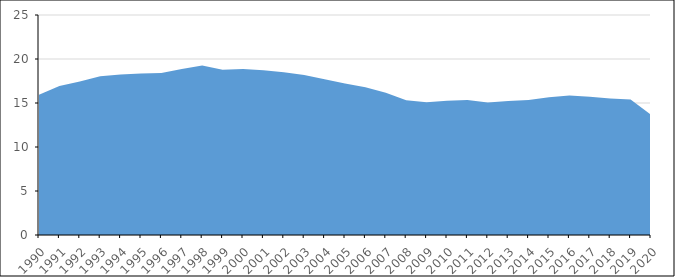
| Category | Véhicules utilitaires légers |
|---|---|
| 1990.0 | 15.925 |
| 1991.0 | 16.926 |
| 1992.0 | 17.435 |
| 1993.0 | 18.051 |
| 1994.0 | 18.251 |
| 1995.0 | 18.358 |
| 1996.0 | 18.4 |
| 1997.0 | 18.867 |
| 1998.0 | 19.254 |
| 1999.0 | 18.774 |
| 2000.0 | 18.867 |
| 2001.0 | 18.715 |
| 2002.0 | 18.487 |
| 2003.0 | 18.187 |
| 2004.0 | 17.694 |
| 2005.0 | 17.225 |
| 2006.0 | 16.793 |
| 2007.0 | 16.172 |
| 2008.0 | 15.323 |
| 2009.0 | 15.077 |
| 2010.0 | 15.248 |
| 2011.0 | 15.328 |
| 2012.0 | 15.053 |
| 2013.0 | 15.239 |
| 2014.0 | 15.33 |
| 2015.0 | 15.653 |
| 2016.0 | 15.844 |
| 2017.0 | 15.721 |
| 2018.0 | 15.52 |
| 2019.0 | 15.395 |
| 2020.0 | 13.659 |